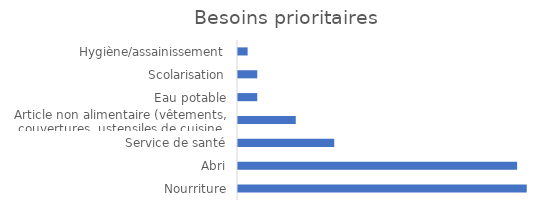
| Category | Series 0 |
|---|---|
| Nourriture | 0.375 |
| Abri | 0.362 |
| Service de santé | 0.125 |
| Article non alimentaire (vêtements, couvertures, ustensiles de cuisine | 0.075 |
| Eau potable | 0.025 |
| Scolarisation | 0.025 |
| Hygiène/assainissement | 0.012 |